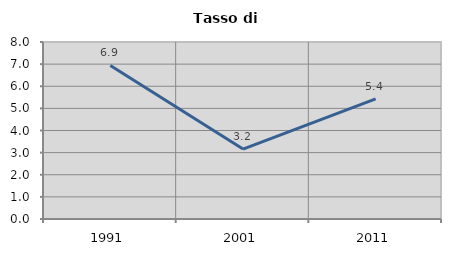
| Category | Tasso di disoccupazione   |
|---|---|
| 1991.0 | 6.942 |
| 2001.0 | 3.16 |
| 2011.0 | 5.43 |